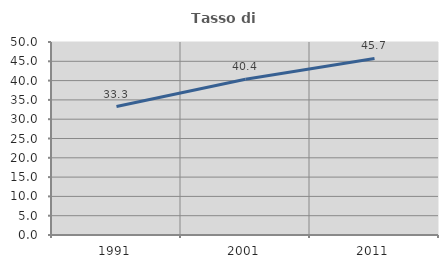
| Category | Tasso di occupazione   |
|---|---|
| 1991.0 | 33.289 |
| 2001.0 | 40.367 |
| 2011.0 | 45.732 |